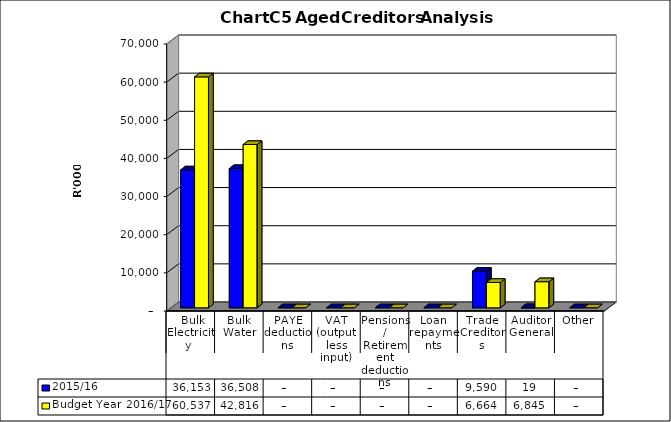
| Category | 2015/16 | Budget Year 2016/17 |
|---|---|---|
|  Bulk Electricity  | 36153000 | 60536557.86 |
| Bulk Water | 36508000 | 42815748.68 |
| PAYE deductions | 0 | 0 |
| VAT (output less input) | 0 | 0 |
| Pensions / Retirement deductions | 0 | 0 |
| Loan repayments | 0 | 0 |
| Trade Creditors | 9590000 | 6664116 |
| Auditor General | 19000 | 6844927 |
| Other | 0 | 0 |